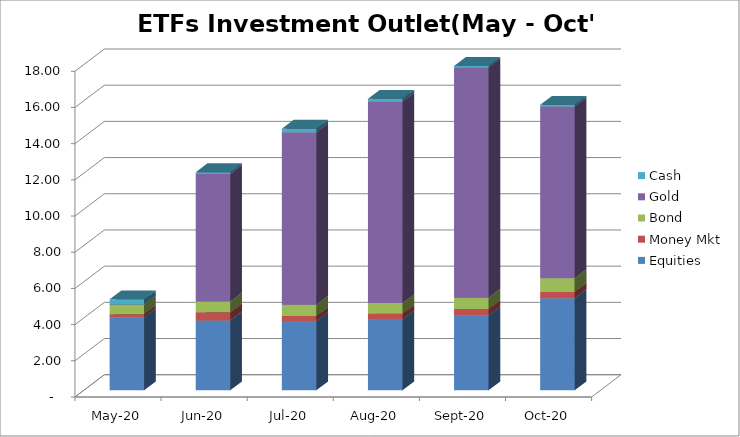
| Category | Equities | Money Mkt | Bond | Gold | Cash |
|---|---|---|---|---|---|
| 2020-05-01 | 4032265012.12 | 177070409.49 | 538903891.86 | 0 | 278503239.37 |
| 2020-06-01 | 3864587279.22 | 452492408.13 | 591048061.03 | 7051738147.24 | 93622092.4 |
| 2020-07-01 | 3831828644.68 | 272103487.34 | 625862830.11 | 9533055643.75 | 191169576.23 |
| 2020-08-01 | 3913723749.54 | 316071867.88 | 592621089.37 | 11135395115.33 | 152002086.71 |
| 2020-09-01 | 4141425949.9 | 349803623.89 | 626583310.45 | 12731001529.98 | 76107936.49 |
| 2020-10-01 | 5094516142.04 | 343013633.71 | 754956015.68 | 9489073502.64 | 94333366.41 |